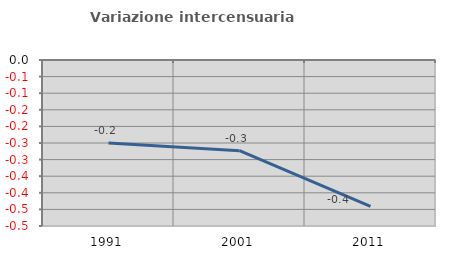
| Category | Variazione intercensuaria annua |
|---|---|
| 1991.0 | -0.25 |
| 2001.0 | -0.273 |
| 2011.0 | -0.441 |